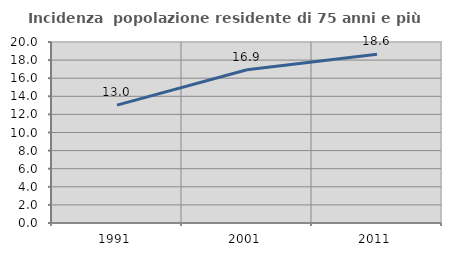
| Category | Incidenza  popolazione residente di 75 anni e più |
|---|---|
| 1991.0 | 13.023 |
| 2001.0 | 16.926 |
| 2011.0 | 18.644 |